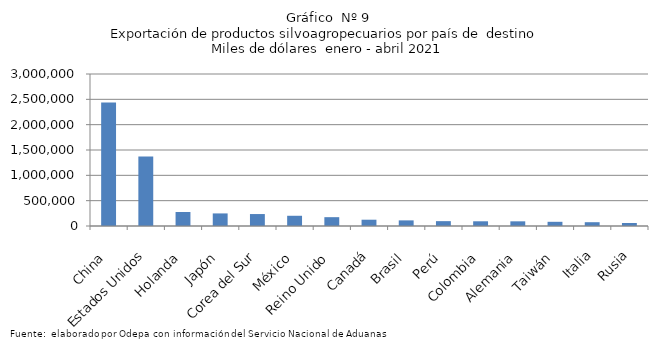
| Category | Series 0 |
|---|---|
| China | 2439842.906 |
| Estados Unidos | 1371883.743 |
| Holanda | 276219.163 |
| Japón | 248275.062 |
| Corea del Sur | 235868.38 |
| México | 201840.186 |
| Reino Unido | 174251.613 |
| Canadá | 124115.8 |
| Brasil | 110858.992 |
| Perú | 95882.265 |
| Colombia | 93100.216 |
| Alemania | 92311.868 |
| Taiwán | 82794.165 |
| Italia | 74988.496 |
| Rusia | 59745.555 |